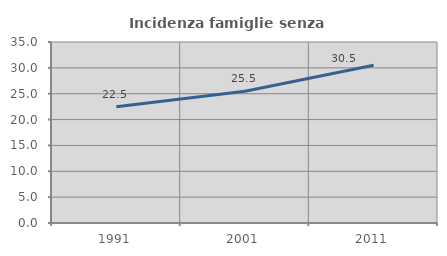
| Category | Incidenza famiglie senza nuclei |
|---|---|
| 1991.0 | 22.491 |
| 2001.0 | 25.465 |
| 2011.0 | 30.511 |